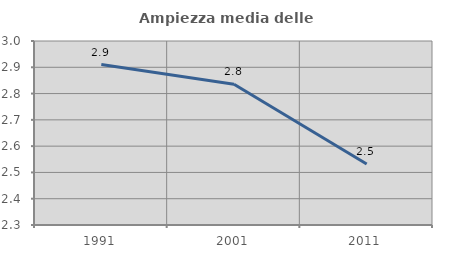
| Category | Ampiezza media delle famiglie |
|---|---|
| 1991.0 | 2.91 |
| 2001.0 | 2.836 |
| 2011.0 | 2.532 |